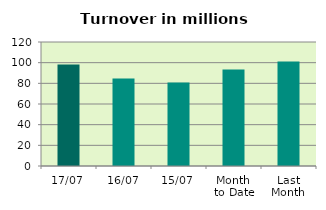
| Category | Series 0 |
|---|---|
| 17/07 | 98.163 |
| 16/07 | 84.769 |
| 15/07 | 80.74 |
| Month 
to Date | 93.404 |
| Last
Month | 101.166 |